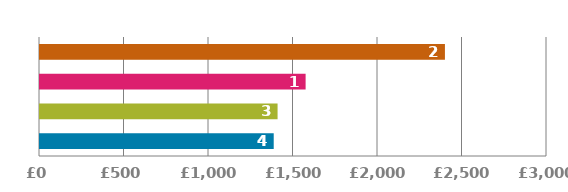
| Category | PAYMENT |
|---|---|
| 0 | 1382.921 |
| 1 | 1405.775 |
| 2 | 1571.655 |
| 3 | 2396.046 |